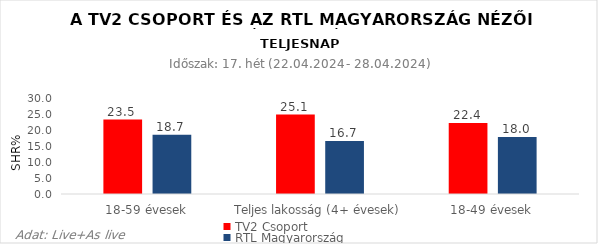
| Category | TV2 Csoport | RTL Magyarország |
|---|---|---|
| 18-59 évesek | 23.5 | 18.7 |
| Teljes lakosság (4+ évesek) | 25.1 | 16.7 |
| 18-49 évesek | 22.4 | 18 |